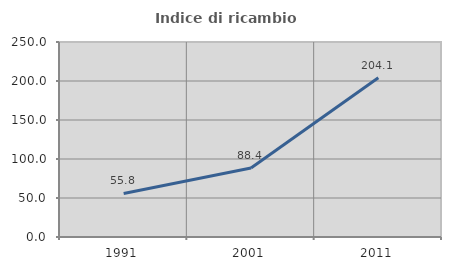
| Category | Indice di ricambio occupazionale  |
|---|---|
| 1991.0 | 55.825 |
| 2001.0 | 88.409 |
| 2011.0 | 204.058 |